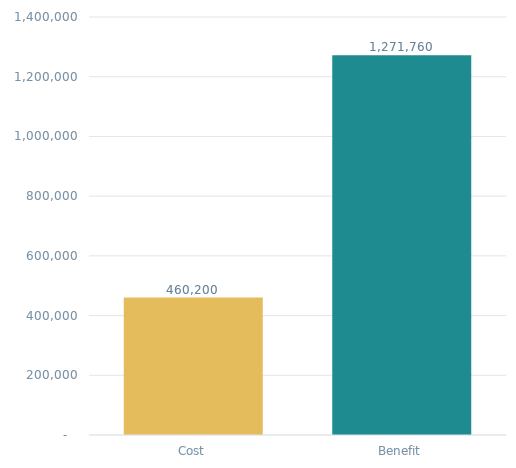
| Category | Series 0 |
|---|---|
| Cost | 460200 |
| Benefit | 1271759.5 |